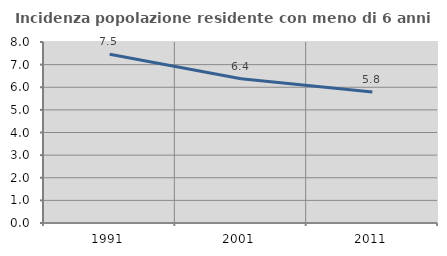
| Category | Incidenza popolazione residente con meno di 6 anni |
|---|---|
| 1991.0 | 7.457 |
| 2001.0 | 6.376 |
| 2011.0 | 5.787 |